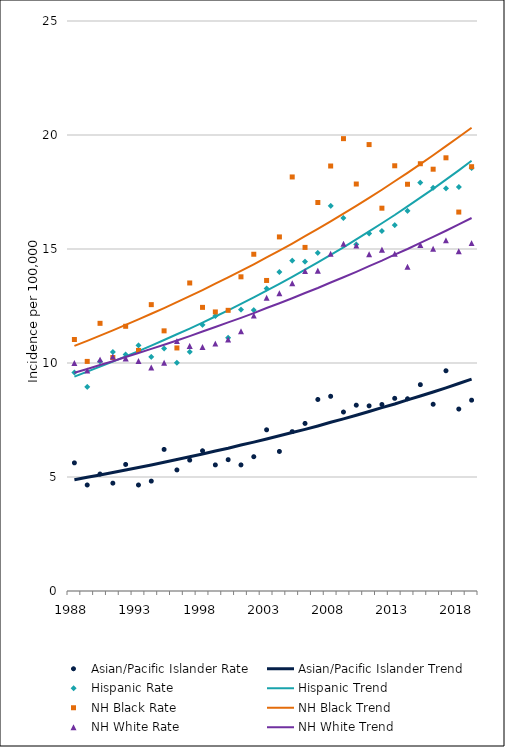
| Category | Asian/Pacific Islander Rate | Asian/Pacific Islander Trend | Hispanic Rate | Hispanic Trend | NH Black Rate | NH Black Trend | NH White Rate | NH White Trend |
|---|---|---|---|---|---|---|---|---|
| 1988.0 | 5.62 | 4.88 | 9.58 | 9.4 | 11.03 | 10.75 | 10 | 9.57 |
| 1989.0 | 4.65 | 4.99 | 8.95 | 9.62 | 10.07 | 10.97 | 9.67 | 9.74 |
| 1990.0 | 5.13 | 5.09 | 10.07 | 9.84 | 11.74 | 11.2 | 10.15 | 9.91 |
| 1991.0 | 4.73 | 5.2 | 10.48 | 10.06 | 10.24 | 11.43 | 10.28 | 10.08 |
| 1992.0 | 5.55 | 5.31 | 10.37 | 10.29 | 11.61 | 11.67 | 10.2 | 10.26 |
| 1993.0 | 4.65 | 5.42 | 10.77 | 10.52 | 10.55 | 11.91 | 10.09 | 10.44 |
| 1994.0 | 4.82 | 5.53 | 10.27 | 10.76 | 12.56 | 12.16 | 9.8 | 10.62 |
| 1995.0 | 6.21 | 5.65 | 10.64 | 11.01 | 11.41 | 12.41 | 10.01 | 10.8 |
| 1996.0 | 5.31 | 5.77 | 10.01 | 11.26 | 10.66 | 12.67 | 10.96 | 10.99 |
| 1997.0 | 5.74 | 5.89 | 10.49 | 11.51 | 13.51 | 12.93 | 10.75 | 11.18 |
| 1998.0 | 6.15 | 6.01 | 11.67 | 11.77 | 12.44 | 13.2 | 10.7 | 11.38 |
| 1999.0 | 5.53 | 6.14 | 12.06 | 12.04 | 12.24 | 13.48 | 10.85 | 11.58 |
| 2000.0 | 5.76 | 6.26 | 11.11 | 12.31 | 12.31 | 13.76 | 11.03 | 11.78 |
| 2001.0 | 5.53 | 6.4 | 12.34 | 12.59 | 13.78 | 14.04 | 11.39 | 11.98 |
| 2002.0 | 5.89 | 6.53 | 12.32 | 12.88 | 14.77 | 14.33 | 12.08 | 12.19 |
| 2003.0 | 7.07 | 6.67 | 13.27 | 13.17 | 13.62 | 14.63 | 12.86 | 12.41 |
| 2004.0 | 6.12 | 6.81 | 13.99 | 13.47 | 15.53 | 14.93 | 13.06 | 12.62 |
| 2005.0 | 6.99 | 6.95 | 14.49 | 13.78 | 18.16 | 15.24 | 13.5 | 12.84 |
| 2006.0 | 7.35 | 7.09 | 14.45 | 14.09 | 15.07 | 15.56 | 14.03 | 13.07 |
| 2007.0 | 8.4 | 7.24 | 14.83 | 14.41 | 17.04 | 15.88 | 14.05 | 13.29 |
| 2008.0 | 8.54 | 7.4 | 16.89 | 14.74 | 18.64 | 16.21 | 14.79 | 13.53 |
| 2009.0 | 7.85 | 7.55 | 16.36 | 15.07 | 19.84 | 16.55 | 15.23 | 13.76 |
| 2010.0 | 8.15 | 7.71 | 15.2 | 15.42 | 17.85 | 16.89 | 15.15 | 14 |
| 2011.0 | 8.12 | 7.87 | 15.68 | 15.77 | 19.58 | 17.24 | 14.77 | 14.25 |
| 2012.0 | 8.18 | 8.04 | 15.79 | 16.13 | 16.79 | 17.6 | 14.97 | 14.49 |
| 2013.0 | 8.45 | 8.2 | 16.05 | 16.49 | 18.65 | 17.97 | 14.79 | 14.75 |
| 2014.0 | 8.43 | 8.38 | 16.67 | 16.87 | 17.84 | 18.34 | 14.22 | 15 |
| 2015.0 | 9.05 | 8.55 | 17.91 | 17.25 | 18.74 | 18.72 | 15.18 | 15.27 |
| 2016.0 | 8.19 | 8.73 | 17.69 | 17.64 | 18.5 | 19.11 | 15.01 | 15.53 |
| 2017.0 | 9.66 | 8.91 | 17.66 | 18.04 | 19 | 19.51 | 15.38 | 15.8 |
| 2018.0 | 7.98 | 9.1 | 17.72 | 18.45 | 16.62 | 19.91 | 14.9 | 16.08 |
| 2019.0 | 8.37 | 9.29 | 18.55 | 18.87 | 18.61 | 20.32 | 15.26 | 16.36 |